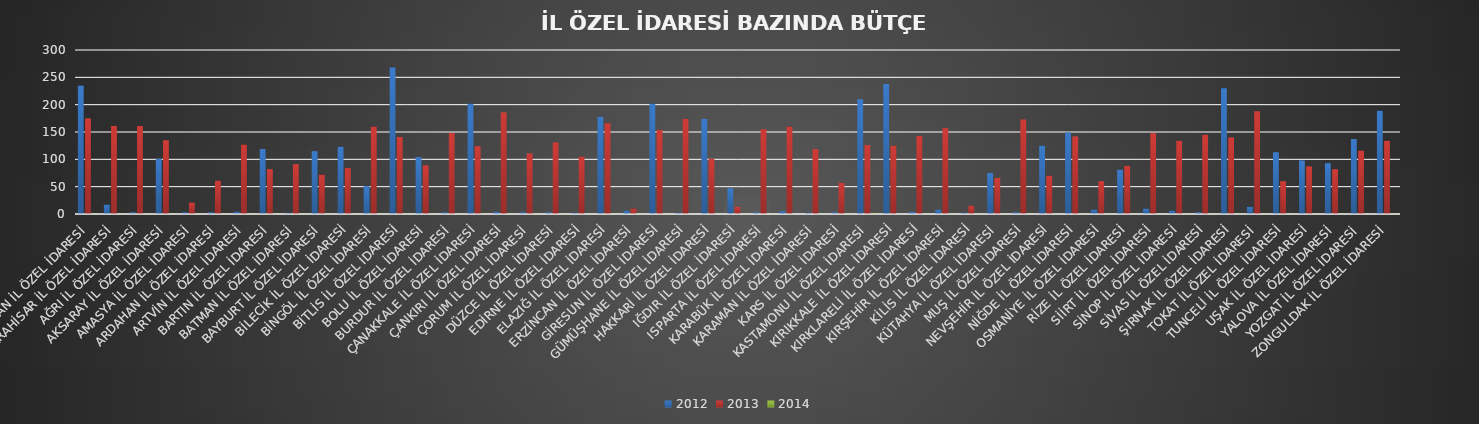
| Category | 2012 | 2013 | 2014 |
|---|---|---|---|
| ADIYAMAN İL ÖZEL İDARESİ | 235 | 175 | 1 |
| AFYONKARAHİSAR İL ÖZEL İDARESİ | 17 | 161 | 1 |
| AĞRI İL ÖZEL İDARESİ | 3 | 161 | 1 |
| AKSARAY İL ÖZEL İDARESİ | 101 | 135 | 1 |
| AMASYA İL ÖZEL İDARESİ | 3 | 21 | 1 |
| ARDAHAN İL ÖZEL İDARESİ | 3 | 61 | 1 |
| ARTVİN İL ÖZEL İDARESİ | 4 | 127 | 1 |
| BARTIN İL ÖZEL İDARESİ | 119 | 82 | 1 |
| BATMAN İL ÖZEL İDARESİ | 2 | 91 | 1 |
| BAYBURT İL ÖZEL İDARESİ | 115 | 72 | 1 |
| BİLECİK İL ÖZEL İDARESİ | 123 | 84 | 1 |
| BİNGÖL İL ÖZEL İDARESİ | 51 | 160 | 1 |
| BİTLİS İL ÖZEL İDARESİ | 268 | 141 | 1 |
| BOLU İL ÖZEL İDARESİ | 104 | 89 | 1 |
| BURDUR İL ÖZEL İDARESİ | 3 | 148 | 1 |
| ÇANAKKALE İL ÖZEL İDARESİ | 202 | 124 | 1 |
| ÇANKIRI İL ÖZEL İDARESİ | 4 | 186 | 1 |
| ÇORUM İL ÖZEL İDARESİ | 3 | 111 | 1 |
| DÜZCE İL ÖZEL İDARESİ | 3 | 131 | 1 |
| EDİRNE İL ÖZEL İDARESİ | 2 | 105 | 1 |
| ELAZIĞ İL ÖZEL İDARESİ | 178 | 166 | 1 |
| ERZİNCAN İL ÖZEL İDARESİ | 6 | 10 | 1 |
| GİRESUN İL ÖZEL İDARESİ | 202 | 154 | 1 |
| GÜMÜŞHANE İL ÖZEL İDARESİ | 2 | 174 | 1 |
| HAKKARİ İL ÖZEL İDARESİ | 174 | 101 | 1 |
| IĞDIR İL ÖZEL İDARESİ | 47 | 13 | 1 |
| ISPARTA İL ÖZEL İDARESİ | 3 | 155 | 1 |
| KARABÜK İL ÖZEL İDARESİ | 5 | 160 | 0 |
| KARAMAN İL ÖZEL İDARESİ | 2 | 119 | 1 |
| KARS İL ÖZEL İDARESİ | 3 | 57 | 1 |
| KASTAMONU İL ÖZEL İDARESİ | 210 | 126 | 2 |
| KIRIKKALE İL ÖZEL İDARESİ | 238 | 125 | 1 |
| KIRKLARELİ İL ÖZEL İDARESİ | 4 | 143 | 1 |
| KIRŞEHİR İL ÖZEL İDARESİ | 8 | 157 | 1 |
| KİLİS İL ÖZEL İDARESİ | 2 | 15 | 1 |
| KÜTAHYA İL ÖZEL İDARESİ | 75 | 66 | 1 |
| MUŞ İL ÖZEL İDARESİ | 3 | 173 | 1 |
| NEVŞEHİR İL ÖZEL İDARESİ | 125 | 70 | 1 |
| NİĞDE İL ÖZEL İDARESİ | 149 | 142 | 1 |
| OSMANİYE İL ÖZEL İDARESİ | 8 | 60 | 1 |
| RİZE İL ÖZEL İDARESİ | 81 | 88 | 1 |
| SİİRT İL ÖZEL İDARESİ | 10 | 148 | 1 |
| SİNOP İL ÖZEL İDARESİ | 6 | 134 | 1 |
| SİVAS İL ÖZEL İDARESİ | 3 | 145 | 1 |
| ŞIRNAK İL ÖZEL İDARESİ | 230 | 140 | 1 |
| TOKAT İL ÖZEL İDARESİ | 13 | 188 | 1 |
| TUNCELİ İL ÖZEL İDARESİ | 113 | 60 | 1 |
| UŞAK İL ÖZEL İDARESİ | 98 | 87 | 1 |
| YALOVA İL ÖZEL İDARESİ | 93 | 82 | 1 |
| YOZGAT İL ÖZEL İDARESİ | 137 | 116 | 1 |
| ZONGULDAK İL ÖZEL İDARESİ | 189 | 134 | 1 |